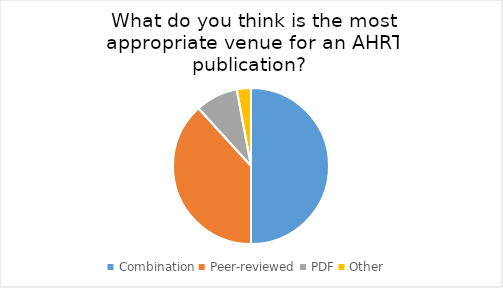
| Category | Series 0 |
|---|---|
| Combination | 17 |
| Peer-reviewed | 13 |
| PDF | 3 |
| Other | 1 |